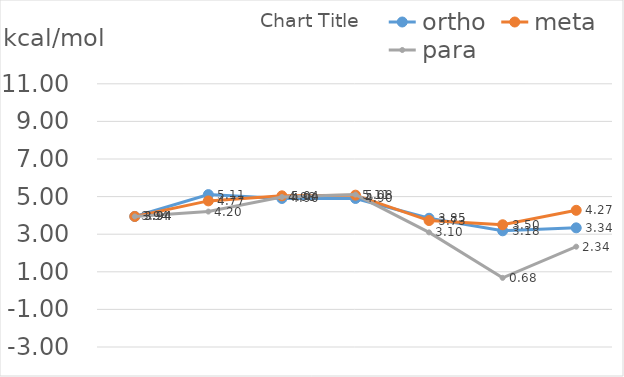
| Category | ortho | meta | para |
|---|---|---|---|
| 0 | 3.944 | 3.944 | 3.944 |
| 1 | 5.106 | 4.771 | 4.204 |
| 2 | 4.9 | 5.041 | 4.978 |
| 3 | 4.9 | 5.077 | 5.107 |
| 4 | 3.848 | 3.726 | 3.097 |
| 5 | 3.18 | 3.502 | 0.678 |
| 6 | 3.338 | 4.271 | 2.336 |